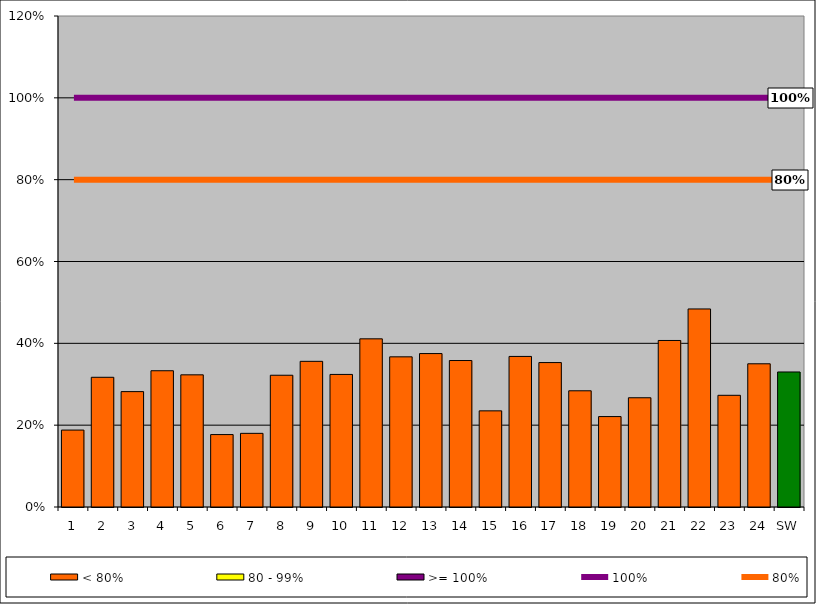
| Category | < 80% | 80 - 99% | >= 100% |
|---|---|---|---|
| 1 | 0.188 | 0 | 0 |
| 2 | 0.317 | 0 | 0 |
| 3 | 0.282 | 0 | 0 |
| 4 | 0.333 | 0 | 0 |
| 5 | 0.323 | 0 | 0 |
| 6 | 0.177 | 0 | 0 |
| 7 | 0.18 | 0 | 0 |
| 8 | 0.322 | 0 | 0 |
| 9 | 0.356 | 0 | 0 |
| 10 | 0.324 | 0 | 0 |
| 11 | 0.411 | 0 | 0 |
| 12 | 0.367 | 0 | 0 |
| 13 | 0.375 | 0 | 0 |
| 14 | 0.358 | 0 | 0 |
| 15 | 0.235 | 0 | 0 |
| 16 | 0.368 | 0 | 0 |
| 17 | 0.353 | 0 | 0 |
| 18 | 0.284 | 0 | 0 |
| 19 | 0.221 | 0 | 0 |
| 20 | 0.267 | 0 | 0 |
| 21 | 0.407 | 0 | 0 |
| 22 | 0.484 | 0 | 0 |
| 23 | 0.273 | 0 | 0 |
| 24 | 0.35 | 0 | 0 |
| SW | 0.33 | 0 | 0 |